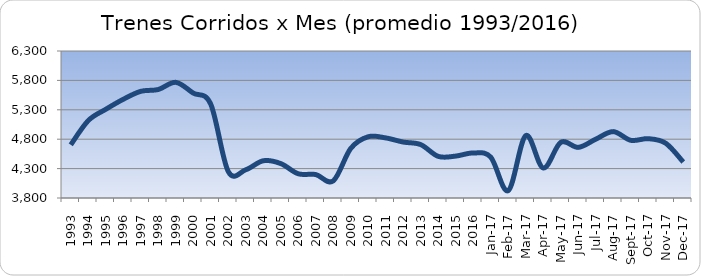
| Category | Series 0 |
|---|---|
| 1993.0 | 4704.75 |
| 1994.0 | 5116.583 |
| 1995.0 | 5308.5 |
| 1996.0 | 5478.833 |
| 1997.0 | 5614.25 |
| 1998.0 | 5645 |
| 1999.0 | 5766.833 |
| 2000.0 | 5584.083 |
| 2001.0 | 5395.583 |
| 2002.0 | 4250.917 |
| 2003.0 | 4280.167 |
| 2004.0 | 4433.333 |
| 2005.0 | 4385.667 |
| 2006.0 | 4211.917 |
| 2007.0 | 4198.583 |
| 2008.0 | 4091.583 |
| 2009.0 | 4643 |
| 2010.0 | 4842.083 |
| 2011.0 | 4821.667 |
| 2012.0 | 4751.333 |
| 2013.0 | 4707.833 |
| 2014.0 | 4507.667 |
| 2015.0 | 4513 |
| 2016.0 | 4565.417 |
| 42736.0 | 4495 |
| 42767.0 | 3926 |
| 42795.0 | 4860 |
| 42826.0 | 4311 |
| 42856.0 | 4746 |
| 42887.0 | 4661 |
| 42917.0 | 4800 |
| 42948.0 | 4929 |
| 42979.0 | 4781 |
| 43009.0 | 4809 |
| 43040.0 | 4731 |
| 43070.0 | 4412 |